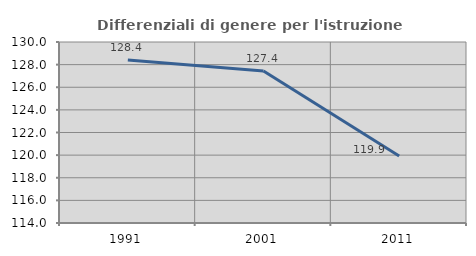
| Category | Differenziali di genere per l'istruzione superiore |
|---|---|
| 1991.0 | 128.404 |
| 2001.0 | 127.441 |
| 2011.0 | 119.92 |